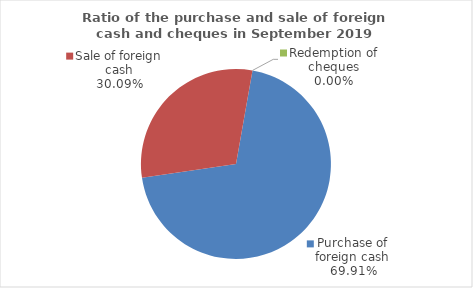
| Category | Series 0 |
|---|---|
| Purchase of foreign cash | 69.914 |
| Sale of foreign cash | 30.086 |
| Redemption of cheques | 0 |